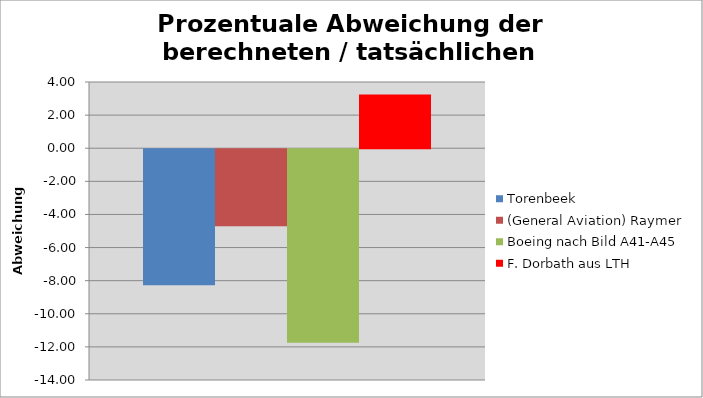
| Category | Torenbeek | (General Aviation) Raymer | Boeing nach Bild A41-A45 | F. Dorbath aus LTH |
|---|---|---|---|---|
| 0 | -8.209 | -4.657 | -11.687 | 3.251 |